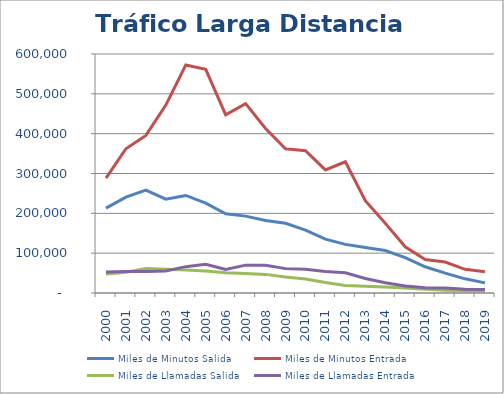
| Category | Miles de Minutos Salida  | Miles de Minutos Entrada | Miles de Llamadas Salida  | Miles de Llamadas Entrada |
|---|---|---|---|---|
| 2000 | 213111.889 | 288388.125 | 47935.313 | 52952.484 |
| 2001 | 240624.31 | 362105.965 | 51890.32 | 54050.474 |
| 2002 | 258263.207 | 395584.068 | 61696.706 | 53755.419 |
| 2003 | 235632.811 | 471710.26 | 59645.256 | 55151.805 |
| 2004 | 244879.421 | 572384.671 | 57875.109 | 66165.546 |
| 2005 | 225481.003 | 561441.7 | 55265.499 | 71975.899 |
| 2006 | 199057.012 | 447154.99 | 51113.174 | 58982.629 |
| 2007 | 193031.5 | 475329.384 | 48858.076 | 69933.935 |
| 2008 | 181903.703 | 413059.388 | 46744.176 | 69543.737 |
| 2009 | 174879.763 | 362075.623 | 40361.941 | 61194.621 |
| 2010 | 157654.648 | 357007.697 | 35316.058 | 59359.736 |
| 2011 | 135339.983 | 308905.292 | 26149.205 | 53691.514 |
| 2012 | 122043.466 | 329431.656 | 19101.011 | 50924.858 |
| 2013 | 114017.404 | 231797.265 | 17114.809 | 36575.406 |
| 2014 | 106668.68 | 175029.52 | 14990.781 | 25922.441 |
| 2015 | 89068.424 | 116143.021 | 12805.823 | 17673.903 |
| 2016 | 65918.92 | 84198.464 | 9191.072 | 13242.616 |
| 2017 | 49870.641 | 77843.799 | 7080.087 | 12633.004 |
| 2018 | 35557.963 | 59535.298 | 5474.876 | 9441.969 |
| 2019 | 25349.667 | 53475.314 | 4208.392 | 9021.467 |